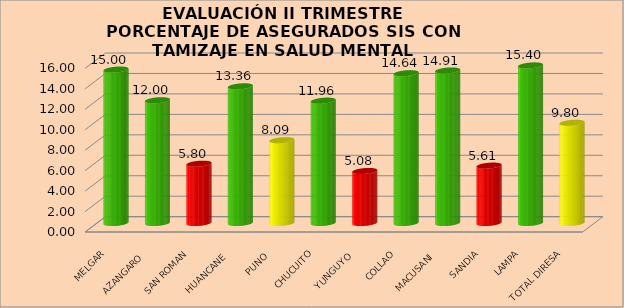
| Category | ATENDIDOS |
|---|---|
| MELGAR | 14.999 |
| AZANGARO | 12.001 |
| SAN ROMAN | 5.797 |
| HUANCANE | 13.361 |
| PUNO | 8.095 |
| CHUCUITO | 11.96 |
| YUNGUYO | 5.084 |
| COLLAO | 14.645 |
| MACUSANI | 14.911 |
| SANDIA | 5.609 |
| LAMPA | 15.403 |
| TOTAL DIRESA | 9.798 |